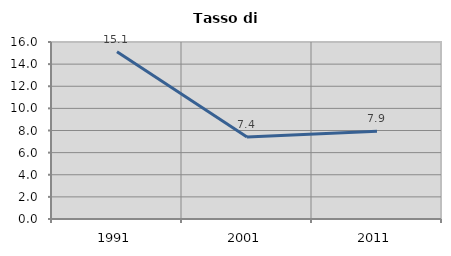
| Category | Tasso di disoccupazione   |
|---|---|
| 1991.0 | 15.129 |
| 2001.0 | 7.419 |
| 2011.0 | 7.936 |